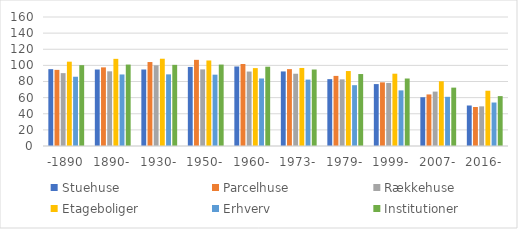
| Category | Stuehuse | Parcelhuse | Rækkehuse | Etageboliger | Erhverv | Institutioner |
|---|---|---|---|---|---|---|
| -1890 | 95.3 | 94.422 | 90.394 | 104.593 | 85.909 | 100.274 |
| 1890- | 94.873 | 97.527 | 92.621 | 108.097 | 88.728 | 100.992 |
| 1930- | 94.884 | 104.14 | 100.074 | 108.239 | 88.847 | 100.637 |
| 1950- | 98.052 | 106.864 | 95.02 | 106.064 | 88.467 | 100.994 |
| 1960- | 98.631 | 101.691 | 92.343 | 96.61 | 83.747 | 98.352 |
| 1973- | 92.475 | 95.343 | 89.628 | 96.79 | 82.354 | 94.877 |
| 1979- | 82.918 | 86.938 | 82.665 | 92.974 | 75.421 | 89.257 |
| 1999- | 76.798 | 78.93 | 78.179 | 89.672 | 68.982 | 83.711 |
| 2007- | 60.479 | 63.96 | 67.473 | 80.266 | 60.999 | 72.4 |
| 2016- | 50.235 | 48.404 | 49.174 | 68.545 | 53.931 | 61.889 |